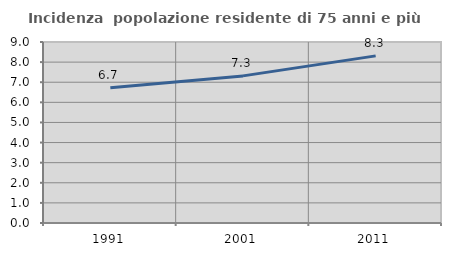
| Category | Incidenza  popolazione residente di 75 anni e più |
|---|---|
| 1991.0 | 6.723 |
| 2001.0 | 7.315 |
| 2011.0 | 8.31 |